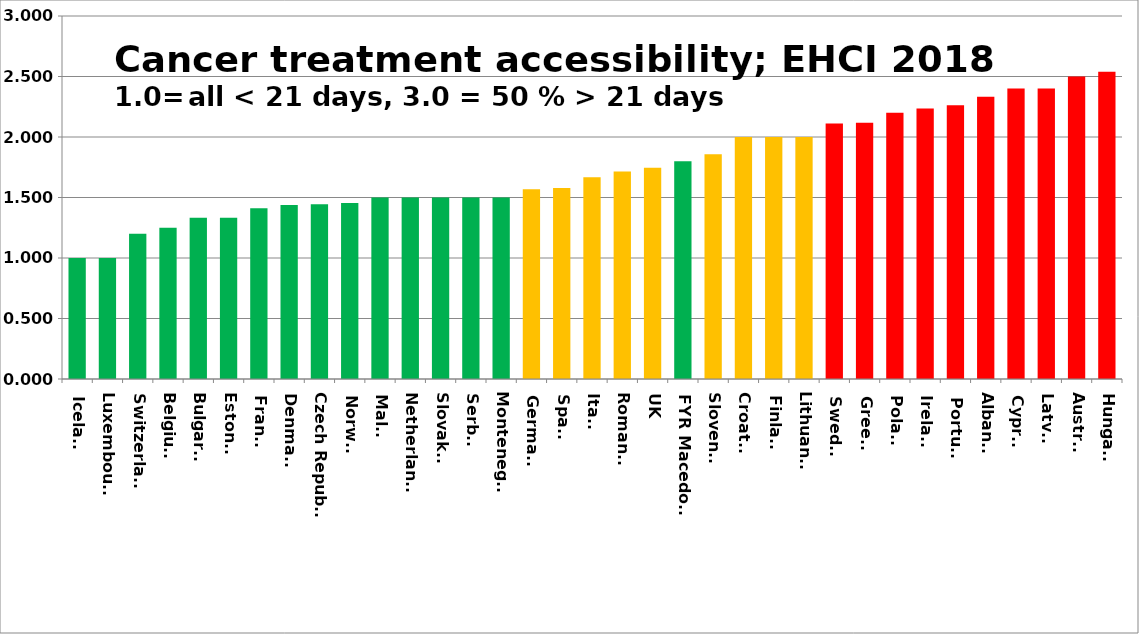
| Category | Series 0 |
|---|---|
| Iceland | 1 |
| Luxembourg | 1 |
| Switzerland | 1.2 |
| Belgium | 1.25 |
| Bulgaria | 1.333 |
| Estonia | 1.333 |
| France | 1.412 |
| Denmark | 1.438 |
| Czech Republic | 1.444 |
| Norway | 1.455 |
| Malta | 1.5 |
| Netherlands | 1.5 |
| Slovakia | 1.5 |
| Serbia | 1.5 |
| Montenegro | 1.5 |
| Germany | 1.568 |
| Spain | 1.578 |
| Italy | 1.667 |
| Romania | 1.714 |
| UK | 1.746 |
| FYR Macedonia | 1.8 |
| Slovenia | 1.857 |
| Croatia | 2 |
| Finland | 2 |
| Lithuania | 2 |
| Sweden | 2.111 |
| Greece | 2.118 |
| Poland | 2.2 |
| Ireland | 2.235 |
| Portugal | 2.263 |
| Albania | 2.333 |
| Cyprus | 2.4 |
| Latvia | 2.4 |
| Austria | 2.5 |
| Hungary | 2.538 |